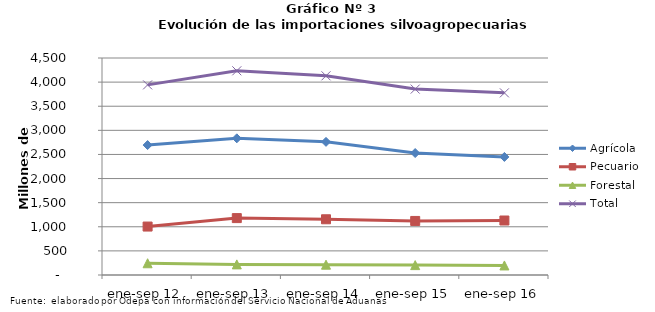
| Category | Agrícola | Pecuario | Forestal | Total |
|---|---|---|---|---|
| ene-sep 12 | 2694337 | 1004651 | 243502 | 3942490 |
| ene-sep 13 | 2834241 | 1180041 | 220233 | 4234515 |
| ene-sep 14 | 2760868 | 1155683 | 213974 | 4130525 |
| ene-sep 15 | 2529140 | 1120911 | 204996 | 3855047 |
| ene-sep 16 | 2448566 | 1130151 | 198175 | 3776892 |